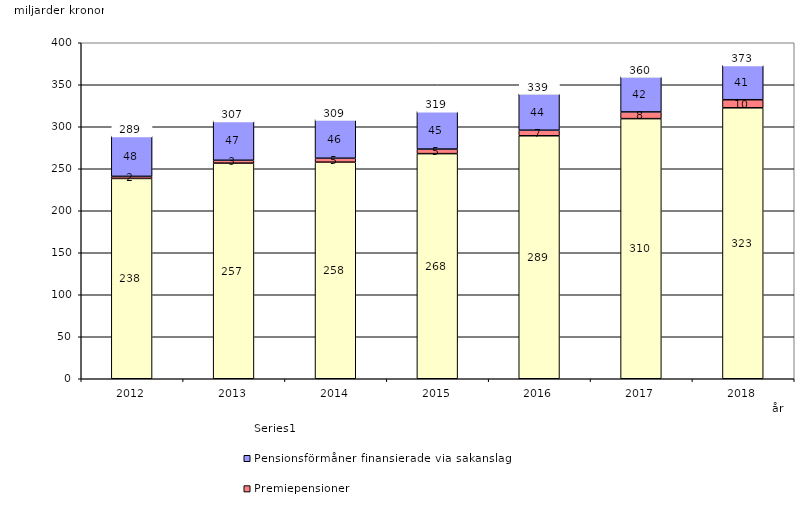
| Category | Inkomstpension och tilläggspension m.m. | Premiepensioner | Pensionsförmåner finansierade via sakanslag | Series 0 |
|---|---|---|---|---|
| 2012.0 | 238.478 | 2.465 | 48.024 | 20 |
| 2013.0 | 256.702 | 3.406 | 46.818 | 20 |
| 2014.0 | 257.861 | 4.694 | 46.213 | 20 |
| 2015.0 | 267.99 | 5.432 | 45.107 | 20 |
| 2016.0 | 289.281 | 6.623 | 43.532 | 20 |
| 2017.0 | 309.657 | 8.011 | 42.134 | 20 |
| 2018.0 | 322.566 | 9.611 | 41.247 | 20 |